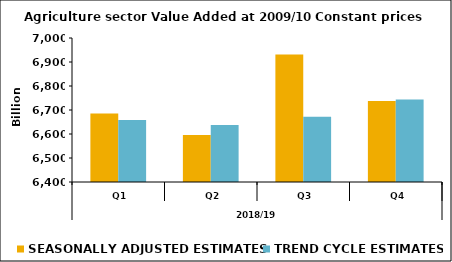
| Category | SEASONALLY ADJUSTED ESTIMATES | TREND CYCLE ESTIMATES |
|---|---|---|
| 0 | 6685.726 | 6657.924 |
| 1 | 6595.789 | 6637.822 |
| 2 | 6931.189 | 6671.497 |
| 3 | 6737.759 | 6744.029 |